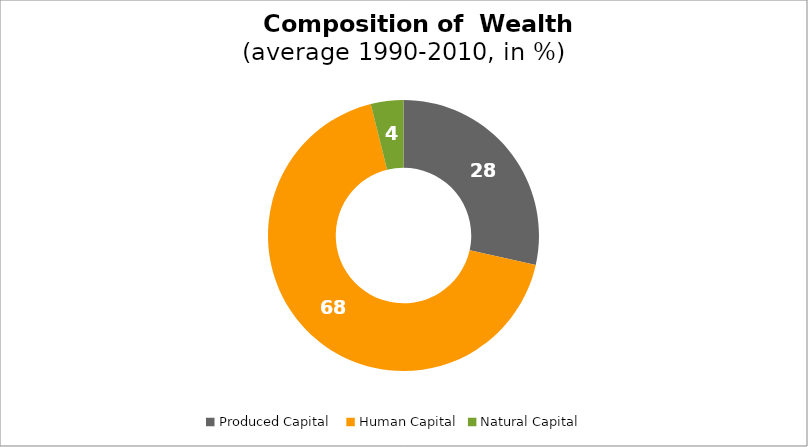
| Category | Series 0 |
|---|---|
| Produced Capital  | 28.495 |
| Human Capital | 67.617 |
| Natural Capital | 3.889 |